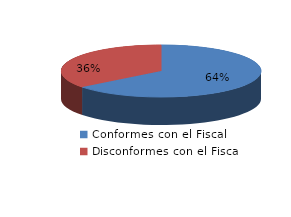
| Category | Series 0 |
|---|---|
| 0 | 13866 |
| 1 | 7668 |